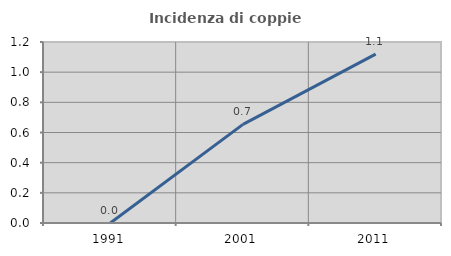
| Category | Incidenza di coppie miste |
|---|---|
| 1991.0 | 0 |
| 2001.0 | 0.654 |
| 2011.0 | 1.119 |